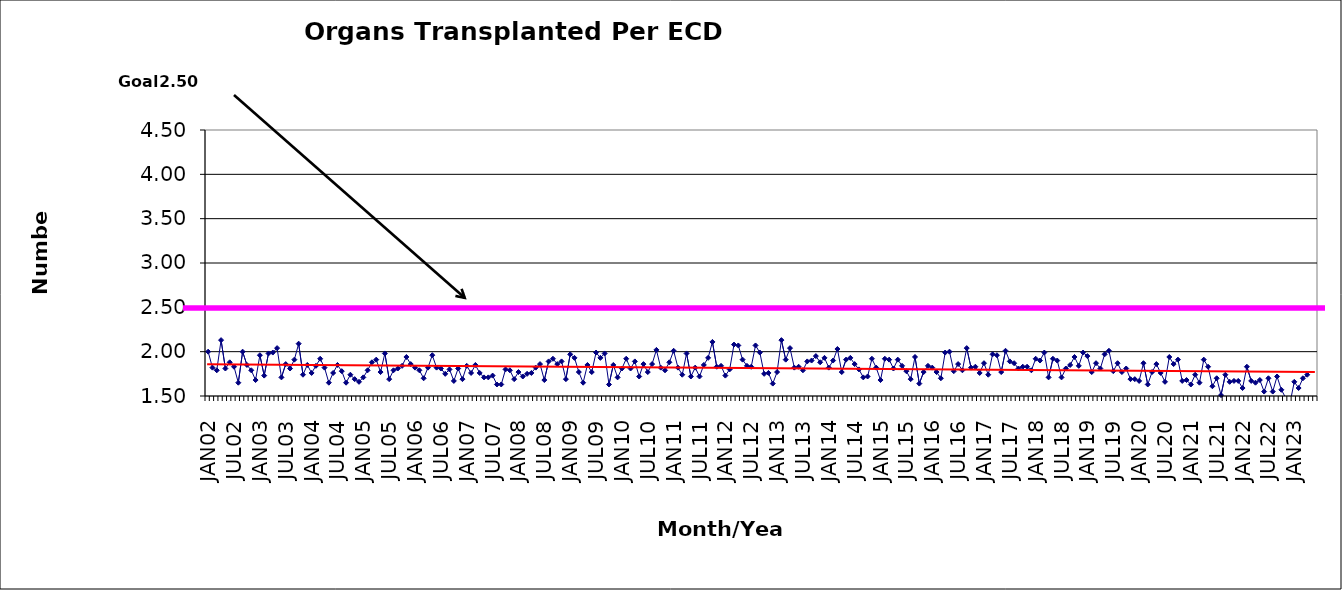
| Category | Series 0 |
|---|---|
| JAN02 | 2 |
| FEB02 | 1.82 |
| MAR02 | 1.79 |
| APR02 | 2.13 |
| MAY02 | 1.81 |
| JUN02 | 1.88 |
| JUL02 | 1.83 |
| AUG02 | 1.65 |
| SEP02 | 2 |
| OCT02 | 1.85 |
| NOV02 | 1.79 |
| DEC02 | 1.68 |
| JAN03 | 1.96 |
| FEB03 | 1.73 |
| MAR03 | 1.98 |
| APR03 | 1.99 |
| MAY03 | 2.04 |
| JUN03 | 1.71 |
| JUL03 | 1.86 |
| AUG03 | 1.81 |
| SEP03 | 1.91 |
| OCT03 | 2.09 |
| NOV03 | 1.74 |
| DEC03 | 1.85 |
| JAN04 | 1.76 |
| FEB04 | 1.84 |
| MAR04 | 1.92 |
| APR04 | 1.82 |
| MAY04 | 1.65 |
| JUN04 | 1.76 |
| JUL04 | 1.85 |
| AUG04 | 1.78 |
| SEP04 | 1.65 |
| OCT04 | 1.74 |
| NOV04 | 1.69 |
| DEC04 | 1.66 |
| JAN05 | 1.71 |
| FEB05 | 1.79 |
| MAR05 | 1.88 |
| APR05 | 1.91 |
| MAY05 | 1.77 |
| JUN05 | 1.98 |
| JUL05 | 1.69 |
| AUG05 | 1.79 |
| SEP05 | 1.81 |
| OCT05 | 1.84 |
| NOV05 | 1.94 |
| DEC05 | 1.86 |
| JAN06 | 1.82 |
| FEB06 | 1.79 |
| MAR06 | 1.7 |
| APR06 | 1.82 |
| MAY06 | 1.96 |
| JUN06 | 1.82 |
| JUL06 | 1.81 |
| AUG06 | 1.75 |
| SEP06 | 1.8 |
| OCT06 | 1.67 |
| NOV06 | 1.81 |
| DEC06 | 1.69 |
| JAN07 | 1.84 |
| FEB07 | 1.76 |
| MAR07 | 1.85 |
| APR07 | 1.76 |
| MAY07 | 1.71 |
| JUN07 | 1.71 |
| JUL07 | 1.73 |
| AUG07 | 1.63 |
| SEP07 | 1.63 |
| OCT07 | 1.8 |
| NOV07 | 1.79 |
| DEC07 | 1.69 |
| JAN08 | 1.77 |
| FEB08 | 1.72 |
| MAR08 | 1.75 |
| APR08 | 1.76 |
| MAY08 | 1.82 |
| JUN08 | 1.86 |
| JUL08 | 1.68 |
| AUG08 | 1.89 |
| SEP08 | 1.92 |
| OCT08 | 1.86 |
| NOV08 | 1.89 |
| DEC08 | 1.69 |
| JAN09 | 1.97 |
| FEB09 | 1.93 |
| MAR09 | 1.77 |
| APR09 | 1.65 |
| MAY09 | 1.85 |
| JUN09 | 1.77 |
| JUL09 | 1.99 |
| AUG09 | 1.93 |
| SEP09 | 1.98 |
| OCT09 | 1.63 |
| NOV09 | 1.85 |
| DEC09 | 1.71 |
| JAN10 | 1.81 |
| FEB10 | 1.92 |
| MAR10 | 1.81 |
| APR10 | 1.89 |
| MAY10 | 1.72 |
| JUN10 | 1.86 |
| JUL10 | 1.77 |
| AUG10 | 1.86 |
| SEP10 | 2.02 |
| OCT10 | 1.82 |
| NOV10 | 1.79 |
| DEC10 | 1.88 |
| JAN11 | 2.01 |
| FEB11 | 1.82 |
| MAR11 | 1.74 |
| APR11 | 1.98 |
| MAY11 | 1.72 |
| JUN11 | 1.82 |
| JUL11 | 1.72 |
| AUG11 | 1.85 |
| SEP11 | 1.93 |
| OCT11 | 2.11 |
| NOV11 | 1.83 |
| DEC11 | 1.84 |
| JAN12 | 1.73 |
| FEB12 | 1.8 |
| MAR12 | 2.08 |
| APR12 | 2.07 |
| MAY12 | 1.91 |
| JUN12 | 1.84 |
| JUL12 | 1.83 |
| AUG12 | 2.07 |
| SEP12 | 1.99 |
| OCT12 | 1.75 |
| NOV12 | 1.76 |
| DEC12 | 1.64 |
| JAN13 | 1.77 |
| FEB13 | 2.13 |
| MAR13 | 1.91 |
| APR13 | 2.04 |
| MAY13 | 1.82 |
| JUN13 | 1.83 |
| JUL13 | 1.79 |
| AUG13 | 1.89 |
| SEP13 | 1.9 |
| OCT13 | 1.95 |
| NOV13 | 1.88 |
| DEC13 | 1.93 |
| JAN14 | 1.82 |
| FEB14 | 1.9 |
| MAR14 | 2.03 |
| APR14 | 1.77 |
| MAY14 | 1.91 |
| JUN14 | 1.93 |
| JUL14 | 1.86 |
| AUG14 | 1.8 |
| SEP14 | 1.71 |
| OCT14 | 1.72 |
| NOV14 | 1.92 |
| DEC14 | 1.82 |
| JAN15 | 1.68 |
| FEB15 | 1.92 |
| MAR15 | 1.91 |
| APR15 | 1.81 |
| MAY15 | 1.91 |
| JUN15 | 1.84 |
| JUL15 | 1.78 |
| AUG15 | 1.69 |
| SEP15 | 1.94 |
| OCT15 | 1.64 |
| NOV15 | 1.77 |
| DEC15 | 1.84 |
| JAN16 | 1.82 |
| FEB16 | 1.77 |
| MAR16 | 1.7 |
| APR16 | 1.99 |
| MAY16 | 2 |
| JUN16 | 1.78 |
| JUL16 | 1.86 |
| AUG16 | 1.79 |
| SEP16 | 2.04 |
| OCT16 | 1.82 |
| NOV16 | 1.83 |
| DEC16 | 1.76 |
| JAN17 | 1.87 |
| FEB17 | 1.74 |
| MAR17 | 1.97 |
| APR17 | 1.96 |
| MAY17 | 1.77 |
| JUN17 | 2.01 |
| JUL17 | 1.89 |
| AUG17 | 1.87 |
| SEP17 | 1.81 |
| OCT17 | 1.83 |
| NOV17 | 1.83 |
| DEC17 | 1.79 |
| JAN18 | 1.92 |
| FEB18 | 1.9 |
| MAR18 | 1.99 |
| APR18 | 1.71 |
| MAY18 | 1.92 |
| JUN18 | 1.9 |
| JUL18 | 1.71 |
| AUG18 | 1.81 |
| SEP18 | 1.85 |
| OCT18 | 1.94 |
| NOV18 | 1.84 |
| DEC18 | 1.99 |
| JAN19 | 1.95 |
| FEB19 | 1.77 |
| MAR19 | 1.87 |
| APR19 | 1.81 |
| MAY19 | 1.97 |
| JUN19 | 2.01 |
| JUL19 | 1.78 |
| AUG19 | 1.87 |
| SEP19 | 1.77 |
| OCT19 | 1.81 |
| NOV19 | 1.69 |
| DEC19 | 1.69 |
| JAN20 | 1.67 |
| FEB20 | 1.87 |
| MAR20 | 1.63 |
| APR20 | 1.77 |
| MAY20 | 1.86 |
| JUN20 | 1.76 |
| JUL20 | 1.66 |
| AUG20 | 1.94 |
| SEP20 | 1.86 |
| OCT20 | 1.91 |
| NOV20 | 1.67 |
| DEC20 | 1.68 |
| JAN21 | 1.63 |
| FEB21 | 1.74 |
| MAR21 | 1.65 |
| APR21 | 1.91 |
| MAY21 | 1.83 |
| JUN21 | 1.61 |
| JUL21 | 1.7 |
| AUG21 | 1.51 |
| SEP21 | 1.74 |
| OCT21 | 1.66 |
| NOV21 | 1.67 |
| DEC21 | 1.67 |
| JAN22 | 1.59 |
| FEB22 | 1.83 |
| MAR22 | 1.67 |
| APR22 | 1.65 |
| MAY22 | 1.68 |
| JUN22 | 1.55 |
| JUL22 | 1.7 |
| AUG22 | 1.55 |
| SEP22 | 1.72 |
| OCT22 | 1.57 |
| NOV22 | 1.48 |
| DEC22 | 1.42 |
| JAN23 | 1.66 |
| FEB23 | 1.59 |
| MAR23 | 1.7 |
| APR23 | 1.74 |